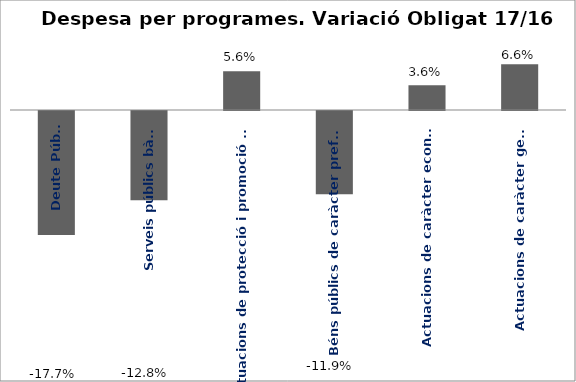
| Category | Series 0 |
|---|---|
| Deute Públic | -0.177 |
| Serveis públics bàsics | -0.128 |
| Actuacions de protecció i promoció social | 0.056 |
| Béns públics de caràcter preferent | -0.119 |
| Actuacions de caràcter econòmic | 0.036 |
| Actuacions de caràcter general | 0.066 |